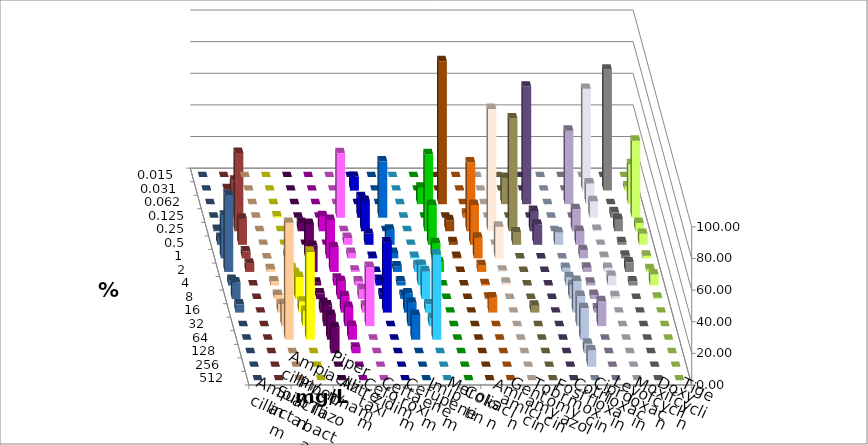
| Category | Ampicillin | Ampicillin/ Sulbactam | Piperacillin | Piperacillin/ Tazobactam | Aztreonam | Cefotaxim | Ceftazidim | Cefuroxim | Imipenem | Meropenem | Colistin | Amikacin | Gentamicin | Tobramycin | Fosfomycin | Cotrimoxazol | Ciprofloxacin | Levofloxacin | Moxifloxacin | Doxycyclin | Tigecyclin |
|---|---|---|---|---|---|---|---|---|---|---|---|---|---|---|---|---|---|---|---|---|---|
| 0.015 | 0 | 0 | 0 | 0 | 0 | 0 | 0 | 0 | 0 | 0 | 0 | 0 | 0 | 0 | 0 | 0 | 0 | 0 | 0 | 0 | 0 |
| 0.031 | 0 | 0 | 0 | 0 | 0 | 8.696 | 0 | 0 | 0 | 0 | 0 | 0 | 0 | 0 | 0 | 0 | 64.348 | 76.522 | 2.609 | 0 | 0.87 |
| 0.062 | 0 | 0 | 0 | 0 | 0 | 0 | 0 | 0 | 10.435 | 90.435 | 0 | 0 | 16.522 | 74.359 | 0 | 46.491 | 13.043 | 0 | 25.217 | 0 | 0 |
| 0.125 | 0 | 0.87 | 0 | 0 | 40.87 | 13.043 | 35.652 | 0 | 0 | 0 | 2.609 | 0 | 0 | 0 | 0 | 0 | 10.435 | 3.478 | 48.696 | 0 | 23.478 |
| 0.25 | 0 | 0 | 5.217 | 9.565 | 0 | 19.13 | 0 | 0 | 48.696 | 6.957 | 43.478 | 77.391 | 71.304 | 12.821 | 0 | 14.035 | 0.87 | 7.826 | 5.217 | 0.87 | 49.565 |
| 0.5 | 0 | 0 | 0 | 0 | 4.348 | 6.957 | 9.565 | 0 | 25.217 | 1.739 | 25.217 | 0 | 7.826 | 12.821 | 7.826 | 8.772 | 0 | 1.739 | 6.957 | 4.348 | 16.522 |
| 1.0 | 0 | 2.609 | 21.739 | 24.348 | 3.478 | 0.87 | 3.478 | 0.87 | 9.565 | 0.87 | 13.043 | 20 | 0 | 0 | 0 | 5.263 | 0.87 | 1.739 | 1.739 | 26.957 | 4.348 |
| 2.0 | 1.739 | 2.609 | 16.522 | 15.652 | 0.87 | 0 | 3.478 | 4.348 | 6.087 | 0 | 4.348 | 0.87 | 0 | 0 | 2.609 | 2.632 | 2.609 | 6.087 | 1.739 | 48.696 | 5.217 |
| 4.0 | 2.609 | 7.826 | 1.739 | 4.348 | 2.609 | 3.478 | 2.609 | 13.043 | 0 | 0 | 0.87 | 1.739 | 0 | 0 | 5.217 | 1.754 | 6.087 | 2.609 | 6.957 | 3.478 | 0 |
| 8.0 | 2.609 | 13.913 | 3.478 | 11.304 | 6.087 | 3.478 | 2.609 | 17.391 | 0 | 0 | 0.87 | 0 | 0 | 0 | 8.696 | 2.632 | 1.739 | 0 | 0.87 | 10.435 | 0 |
| 16.0 | 5.217 | 6.957 | 6.087 | 10.435 | 4.348 | 44.348 | 12.174 | 5.217 | 0 | 0 | 9.565 | 0 | 4.348 | 0 | 20 | 2.632 | 0 | 0 | 0 | 5.217 | 0 |
| 32.0 | 13.913 | 9.565 | 13.043 | 12.174 | 37.391 | 0 | 14.783 | 5.217 | 0 | 0 | 0 | 0 | 0 | 0 | 19.13 | 15.789 | 0 | 0 | 0 | 0 | 0 |
| 64.0 | 73.913 | 55.652 | 15.652 | 8.696 | 0 | 0 | 15.652 | 53.913 | 0 | 0 | 0 | 0 | 0 | 0 | 20 | 0 | 0 | 0 | 0 | 0 | 0 |
| 128.0 | 0 | 0 | 16.522 | 3.478 | 0 | 0 | 0 | 0 | 0 | 0 | 0 | 0 | 0 | 0 | 6.087 | 0 | 0 | 0 | 0 | 0 | 0 |
| 256.0 | 0 | 0 | 0 | 0 | 0 | 0 | 0 | 0 | 0 | 0 | 0 | 0 | 0 | 0 | 10.435 | 0 | 0 | 0 | 0 | 0 | 0 |
| 512.0 | 0 | 0 | 0 | 0 | 0 | 0 | 0 | 0 | 0 | 0 | 0 | 0 | 0 | 0 | 0 | 0 | 0 | 0 | 0 | 0 | 0 |